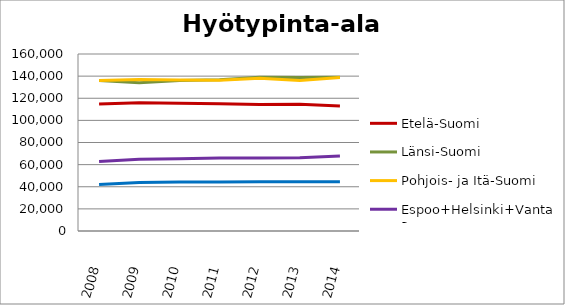
| Category | Etelä-Suomi | Länsi-Suomi | Pohjois- ja Itä-Suomi | Espoo+Helsinki+Vantaa | Muu Uusimaa |
|---|---|---|---|---|---|
| 2008.0 | 114791 | 136138.9 | 135984.5 | 62893 | 41934.8 |
| 2009.0 | 115909 | 134022 | 136855 | 64823.5 | 43800.2 |
| 2010.0 | 115471.7 | 136145.4 | 136391.9 | 65269.3 | 44268.78 |
| 2011.0 | 115054.2 | 136620.3 | 136219.5 | 65955 | 44248 |
| 2012.0 | 114463 | 138960.3 | 138141.5 | 66068 | 44408 |
| 2013.0 | 114552 | 138793 | 135982.5 | 66193 | 44449 |
| 2014.0 | 112977 | 138963 | 138679.1 | 67727 | 44582.5 |